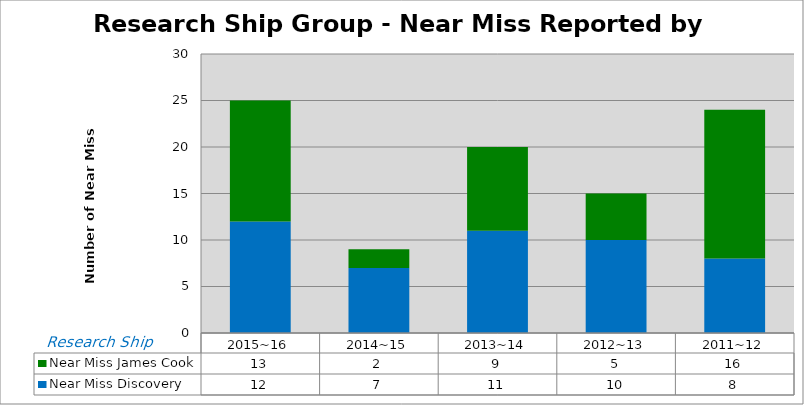
| Category | Near Miss |
|---|---|
| 2015~16 | 13 |
| 2014~15 | 2 |
| 2013~14 | 9 |
| 2012~13 | 5 |
| 2011~12 | 16 |